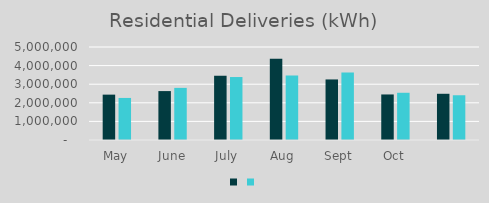
| Category | Series 1 | Series 0 |
|---|---|---|
| May | 2439036 | 2261207 |
| June | 2629934 | 2802052 |
| July | 3456641 | 3385366 |
| Aug | 4364840 | 3470448 |
| Sept | 3255766 | 3631455 |
| Oct | 2448610 | 2538922 |